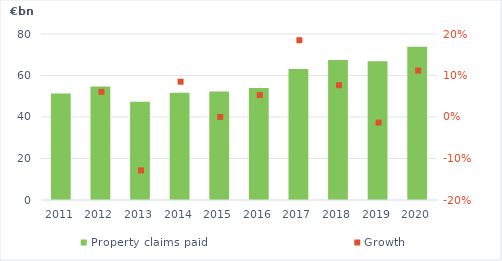
| Category | Property claims paid |
|---|---|
| 2011.0 | 51.31 |
| 2012.0 | 54.722 |
| 2013.0 | 47.379 |
| 2014.0 | 51.66 |
| 2015.0 | 52.316 |
| 2016.0 | 53.987 |
| 2017.0 | 63.074 |
| 2018.0 | 67.48 |
| 2019.0 | 66.875 |
| 2020.0 | 73.873 |